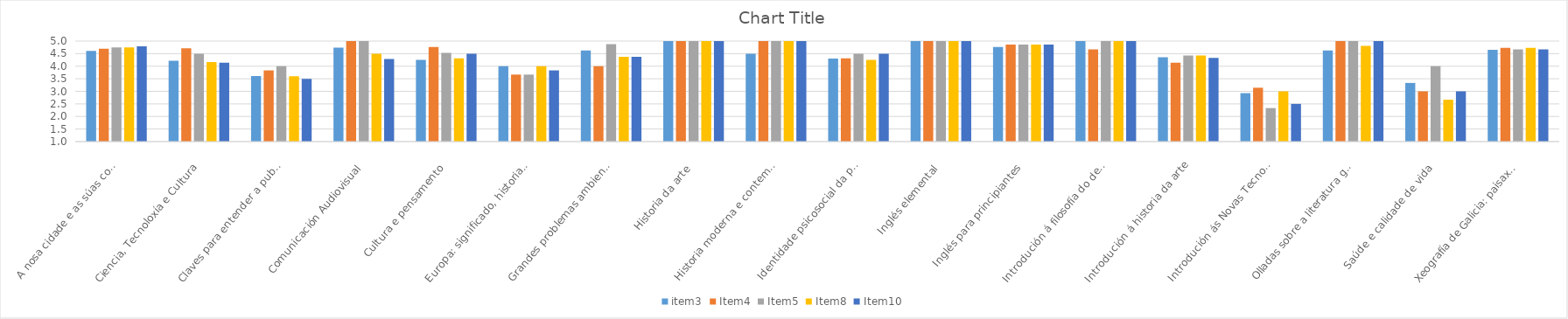
| Category | item3 | Item4 | Item5 | Item8 | Item10 |
|---|---|---|---|---|---|
| A nosa cidade e as súas cousas | 4.612 | 4.7 | 4.75 | 4.75 | 4.789 |
| Ciencia, Tecnoloxía e Cultura | 4.214 | 4.714 | 4.5 | 4.167 | 4.143 |
| Claves para entender a publicidade | 3.611 | 3.833 | 4 | 3.6 | 3.5 |
| Comunicación Audiovisual | 4.738 | 5 | 5 | 4.5 | 4.286 |
| Cultura e pensamento | 4.25 | 4.765 | 4.529 | 4.312 | 4.5 |
| Europa: significado, historia e cultura | 4 | 3.667 | 3.667 | 4 | 3.833 |
| Grandes problemas ambientais do noso tempo | 4.625 | 4 | 4.875 | 4.375 | 4.375 |
| Historia da arte | 5 | 5 | 5 | 5 | 5 |
| Historia moderna e contemporánea de España | 4.5 | 5 | 5 | 5 | 5 |
| Identidade psicosocial da persoa adulta | 4.302 | 4.312 | 4.5 | 4.25 | 4.5 |
| Inglés elemental | 5 | 5 | 5 | 5 | 5 |
| Inglés para principiantes | 4.762 | 4.857 | 4.857 | 4.857 | 4.857 |
| Introdución á filosofía do dereito  | 5 | 4.667 | 5 | 5 | 5 |
| Introdución á historia da arte | 4.357 | 4.143 | 4.429 | 4.429 | 4.333 |
| Introdución ás Novas Tecnoloxías II | 2.929 | 3.143 | 2.333 | 3 | 2.5 |
| Olladas sobre a literatura galega | 4.627 | 5 | 5 | 4.812 | 5 |
| Saúde e calidade de vida | 3.333 | 3 | 4 | 2.667 | 3 |
| Xeografía de Galicia: paisaxes naturais e humanas | 4.656 | 4.733 | 4.667 | 4.733 | 4.667 |